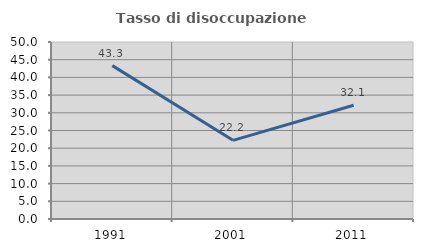
| Category | Tasso di disoccupazione giovanile  |
|---|---|
| 1991.0 | 43.333 |
| 2001.0 | 22.222 |
| 2011.0 | 32.143 |